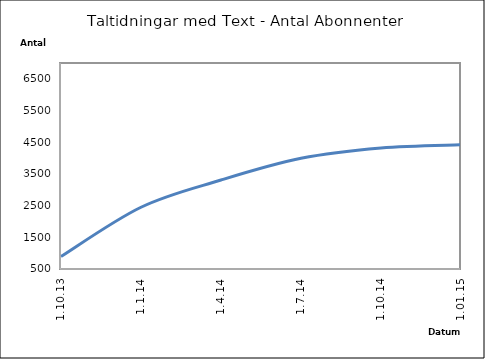
| Category | Series 0 |
|---|---|
| 1.10.13 | 894 |
| 1.1.14 | 2449 |
| 1.4.14 | 3307 |
| 1.7.14 | 3993 |
| 1.10.14 | 4320 |
| 1.01.15 | 4421 |